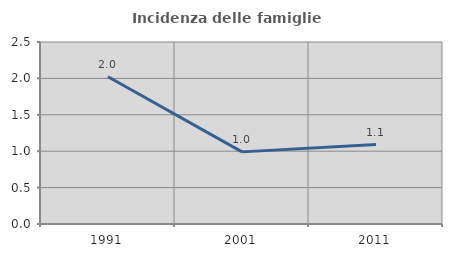
| Category | Incidenza delle famiglie numerose |
|---|---|
| 1991.0 | 2.022 |
| 2001.0 | 0.991 |
| 2011.0 | 1.092 |